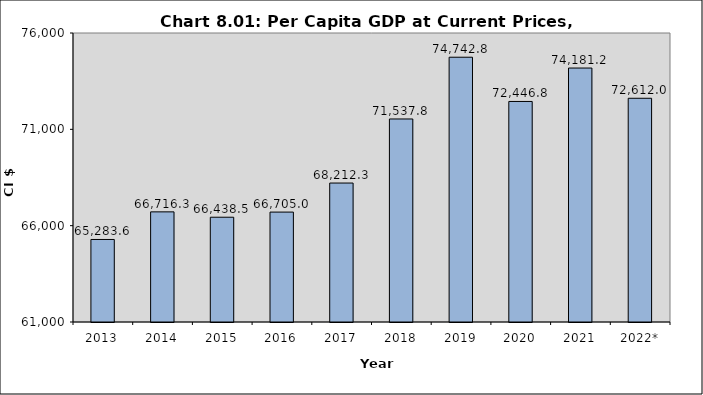
| Category | Series 0 |
|---|---|
| 2013 | 65283.559 |
| 2014 | 66716.312 |
| 2015 | 66438.463 |
| 2016 | 66705 |
| 2017 | 68212.3 |
| 2018 | 71537.8 |
| 2019 | 74742.795 |
| 2020 | 72446.842 |
| 2021 | 74181.192 |
| 2022* | 72612 |